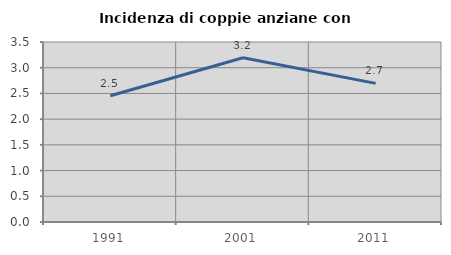
| Category | Incidenza di coppie anziane con figli |
|---|---|
| 1991.0 | 2.454 |
| 2001.0 | 3.193 |
| 2011.0 | 2.695 |